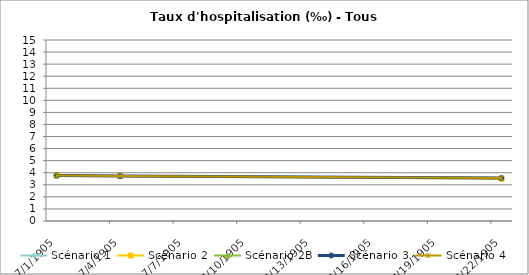
| Category | Scénario 1 | Scénario 2 | Scénario 2B | Scénario 3 | Scénario 4 |
|---|---|---|---|---|---|
| 2009.0 | 3.778 | 3.778 | 3.778 | 3.778 | 3.778 |
| 2012.0 | 3.737 | 3.737 | 3.737 | 3.737 | 3.737 |
| 2030.0 | 3.565 | 3.508 | 3.565 | 3.565 | 3.565 |